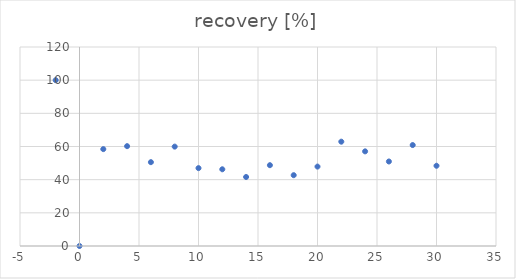
| Category | recovery [%] |
|---|---|
| -2.0 | 100 |
| 0.0 | 0 |
| 2.0 | 58.419 |
| 4.0 | 60.208 |
| 6.0 | 50.553 |
| 8.0 | 59.926 |
| 10.0 | 46.965 |
| 12.0 | 46.257 |
| 14.0 | 41.616 |
| 16.0 | 48.733 |
| 18.0 | 42.701 |
| 20.0 | 47.887 |
| 22.0 | 62.907 |
| 24.0 | 57.074 |
| 26.0 | 50.963 |
| 28.0 | 60.868 |
| 30.0 | 48.387 |